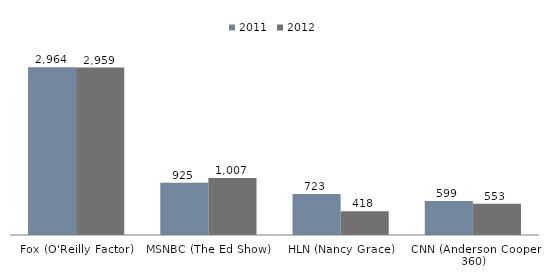
| Category | 2011 | 2012 |
|---|---|---|
| Fox (O'Reilly Factor) | 2964 | 2959 |
| MSNBC (The Ed Show) | 925 | 1007 |
| HLN (Nancy Grace) | 723 | 418 |
| CNN (Anderson Cooper 360) | 599 | 553 |